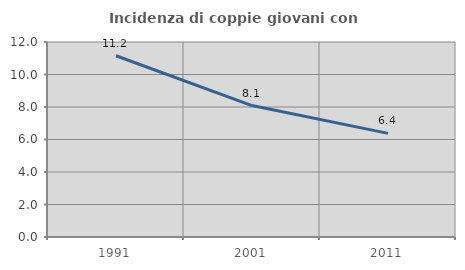
| Category | Incidenza di coppie giovani con figli |
|---|---|
| 1991.0 | 11.154 |
| 2001.0 | 8.088 |
| 2011.0 | 6.376 |